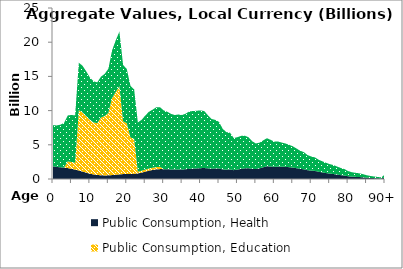
| Category | Public Consumption, Health | Public Consumption, Education | Public Consumption, Other than health and education |
|---|---|---|---|
| 0 | 1857.037 | 0 | 6024.006 |
|  | 1764.886 | 0 | 6062.759 |
| 2 | 1707.652 | 0 | 6233.835 |
| 3 | 1673.412 | 0 | 6522.293 |
| 4 | 1597.453 | 974.209 | 6722.797 |
| 5 | 1491.679 | 995.445 | 6869.345 |
| 6 | 1370.42 | 1004.624 | 6932.684 |
| 7 | 1238.455 | 8811.02 | 6944.517 |
| 8 | 1087.639 | 8653.427 | 6820.308 |
| 9 | 925.497 | 8288.631 | 6532.79 |
| 10 | 774.882 | 7871.878 | 6204.32 |
| 11 | 664.521 | 7614.818 | 6001.715 |
| 12 | 592.703 | 7570.023 | 5966.409 |
| 13 | 543.555 | 8438.69 | 5981.632 |
| 14 | 524.725 | 8682.853 | 6154.702 |
| 15 | 534.59 | 9113.706 | 6460.106 |
| 16 | 571.623 | 11224.84 | 6981.885 |
| 17 | 621.297 | 12112.109 | 7533.77 |
| 18 | 675.678 | 12873.044 | 8007.073 |
| 19 | 718.309 | 7728.005 | 8224.862 |
| 20 | 722.899 | 7443.452 | 7922.015 |
| 21 | 732.943 | 5342.84 | 7554.811 |
| 22 | 755.301 | 5113.776 | 7230.912 |
| 23 | 815.496 | 273.604 | 7185.168 |
| 24 | 923.008 | 282.946 | 7430.506 |
| 25 | 1078.531 | 300.5 | 7891.502 |
| 26 | 1218.675 | 315.691 | 8290.428 |
| 27 | 1319.454 | 323.493 | 8495.319 |
| 28 | 1413.358 | 333.101 | 8747.629 |
| 29 | 1446.297 | 332.277 | 8725.996 |
| 30 | 1442.163 | 0 | 8587.843 |
| 31 | 1427.411 | 0 | 8406.716 |
| 32 | 1391.952 | 0 | 8124.93 |
| 33 | 1376.579 | 0 | 7979.621 |
| 34 | 1393.233 | 0 | 8035.775 |
| 35 | 1386.315 | 0 | 7971.235 |
| 36 | 1425.397 | 0 | 8137.305 |
| 37 | 1489.723 | 0 | 8409.679 |
| 38 | 1514.566 | 0 | 8420.166 |
| 39 | 1547.335 | 0 | 8439.426 |
| 40 | 1583.499 | 0 | 8444.859 |
| 41 | 1606.306 | 0 | 8330.808 |
| 42 | 1549.32 | 0 | 7773.694 |
| 43 | 1504.435 | 0 | 7269.065 |
| 44 | 1534.331 | 0 | 7112.969 |
| 45 | 1537.71 | 0 | 6815.38 |
| 46 | 1403.107 | 0 | 5930.116 |
| 47 | 1364.364 | 0 | 5488.913 |
| 48 | 1402.121 | 0 | 5362.845 |
| 49 | 1292.222 | 0 | 4692.165 |
| 50 | 1377.353 | 0 | 4744.213 |
| 51 | 1480.475 | 0 | 4823.287 |
| 52 | 1553.43 | 0 | 4771.801 |
| 53 | 1570.032 | 0 | 4536.204 |
| 54 | 1486.542 | 0 | 4034.015 |
| 55 | 1466.379 | 0 | 3730.829 |
| 56 | 1559.336 | 0 | 3755.308 |
| 57 | 1714.596 | 0 | 3938.915 |
| 58 | 1860.3 | 0 | 4105.081 |
| 59 | 1827.273 | 0 | 3898.477 |
| 60 | 1775.085 | 0 | 3683.758 |
| 61 | 1813.737 | 0 | 3668.778 |
| 62 | 1790.394 | 0 | 3537.645 |
| 63 | 1771.306 | 0 | 3425.667 |
| 64 | 1729.238 | 0 | 3279.38 |
| 65 | 1670.367 | 0 | 3111.897 |
| 66 | 1578.245 | 0 | 2886.39 |
| 67 | 1480.095 | 0 | 2655.5 |
| 68 | 1425.123 | 0 | 2506.725 |
| 69 | 1284.837 | 0 | 2214.277 |
| 70 | 1224.388 | 0 | 2066.422 |
| 71 | 1182.983 | 0 | 1974.856 |
| 72 | 1058.007 | 0 | 1764.659 |
| 73 | 964.776 | 0 | 1624.066 |
| 74 | 874.226 | 0 | 1500.129 |
| 75 | 785.32 | 0 | 1388.227 |
| 76 | 727.339 | 0 | 1317.742 |
| 77 | 639.757 | 0 | 1181.071 |
| 78 | 564.274 | 0 | 1054.974 |
| 79 | 503.106 | 0 | 946.288 |
| 80 | 403.44 | 0 | 758.828 |
| 81 | 343.668 | 0 | 646.404 |
| 82 | 313.288 | 0 | 589.262 |
| 83 | 290.687 | 0 | 546.752 |
| 84 | 245.47 | 0 | 461.703 |
| 85 | 194.018 | 0 | 364.928 |
| 86 | 155.375 | 0 | 292.244 |
| 87 | 127.538 | 0 | 239.886 |
| 88 | 103.094 | 0 | 193.91 |
| 89 | 80.998 | 0 | 152.348 |
| 90+ | 231.034 | 0 | 434.551 |